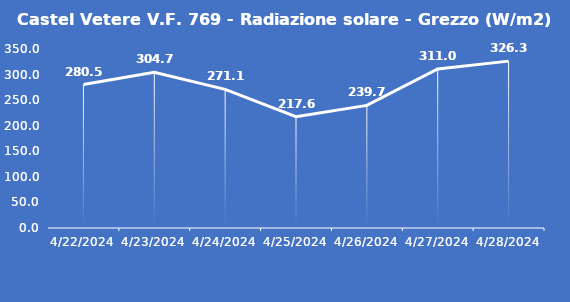
| Category | Castel Vetere V.F. 769 - Radiazione solare - Grezzo (W/m2) |
|---|---|
| 4/22/24 | 280.5 |
| 4/23/24 | 304.7 |
| 4/24/24 | 271.1 |
| 4/25/24 | 217.6 |
| 4/26/24 | 239.7 |
| 4/27/24 | 311 |
| 4/28/24 | 326.3 |